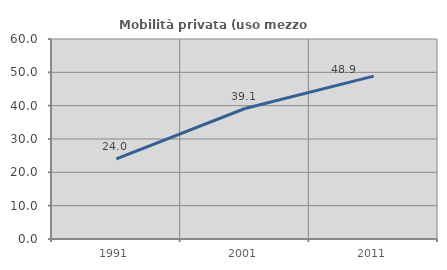
| Category | Mobilità privata (uso mezzo privato) |
|---|---|
| 1991.0 | 24.044 |
| 2001.0 | 39.144 |
| 2011.0 | 48.867 |